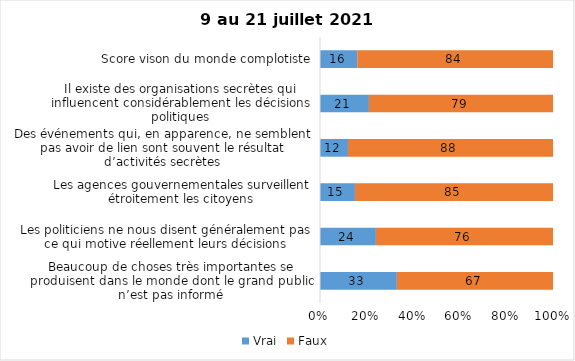
| Category | Vrai | Faux |
|---|---|---|
| Beaucoup de choses très importantes se produisent dans le monde dont le grand public n’est pas informé | 33 | 67 |
| Les politiciens ne nous disent généralement pas ce qui motive réellement leurs décisions | 24 | 76 |
| Les agences gouvernementales surveillent étroitement les citoyens | 15 | 85 |
| Des événements qui, en apparence, ne semblent pas avoir de lien sont souvent le résultat d’activités secrètes | 12 | 88 |
| Il existe des organisations secrètes qui influencent considérablement les décisions politiques | 21 | 79 |
| Score vison du monde complotiste | 16 | 84 |